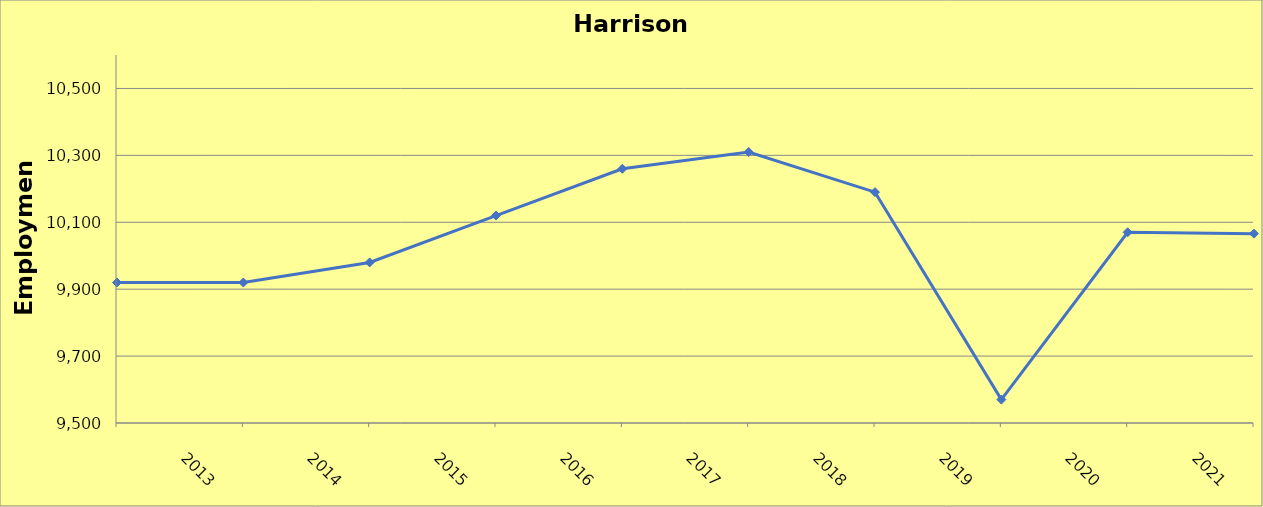
| Category | Harrison County |
|---|---|
| 2013.0 | 9920 |
| 2014.0 | 9920 |
| 2015.0 | 9980 |
| 2016.0 | 10120 |
| 2017.0 | 10260 |
| 2018.0 | 10310 |
| 2019.0 | 10190 |
| 2020.0 | 9570 |
| 2021.0 | 10070 |
| 2022.0 | 10066 |